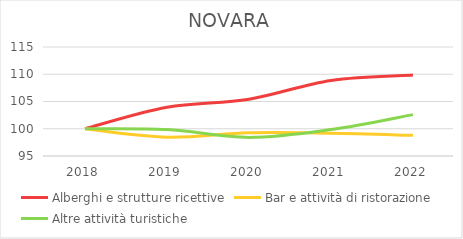
| Category | Alberghi e strutture ricettive | Bar e attività di ristorazione | Altre attività turistiche |
|---|---|---|---|
| 2018.0 | 100 | 100 | 100 |
| 2019.0 | 103.941 | 98.462 | 99.856 |
| 2020.0 | 105.419 | 99.252 | 98.415 |
| 2021.0 | 108.867 | 99.168 | 99.856 |
| 2022.0 | 109.852 | 98.794 | 102.594 |